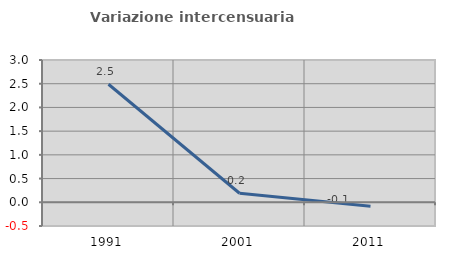
| Category | Variazione intercensuaria annua |
|---|---|
| 1991.0 | 2.489 |
| 2001.0 | 0.191 |
| 2011.0 | -0.082 |